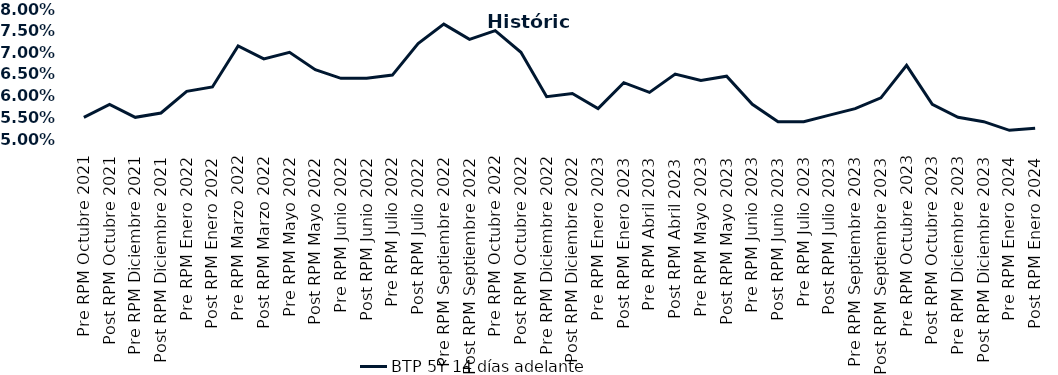
| Category | BTP 5Y 14 días adelante |
|---|---|
| Pre RPM Octubre 2021 | 0.055 |
| Post RPM Octubre 2021 | 0.058 |
| Pre RPM Diciembre 2021 | 0.055 |
| Post RPM Diciembre 2021 | 0.056 |
| Pre RPM Enero 2022 | 0.061 |
| Post RPM Enero 2022 | 0.062 |
| Pre RPM Marzo 2022 | 0.072 |
| Post RPM Marzo 2022 | 0.068 |
| Pre RPM Mayo 2022 | 0.07 |
| Post RPM Mayo 2022 | 0.066 |
| Pre RPM Junio 2022 | 0.064 |
| Post RPM Junio 2022 | 0.064 |
| Pre RPM Julio 2022 | 0.065 |
| Post RPM Julio 2022 | 0.072 |
| Pre RPM Septiembre 2022 | 0.076 |
| Post RPM Septiembre 2022 | 0.073 |
| Pre RPM Octubre 2022 | 0.075 |
| Post RPM Octubre 2022 | 0.07 |
| Pre RPM Diciembre 2022 | 0.06 |
| Post RPM Diciembre 2022 | 0.06 |
| Pre RPM Enero 2023 | 0.057 |
| Post RPM Enero 2023 | 0.063 |
| Pre RPM Abril 2023 | 0.061 |
| Post RPM Abril 2023 | 0.065 |
| Pre RPM Mayo 2023 | 0.064 |
| Post RPM Mayo 2023 | 0.064 |
| Pre RPM Junio 2023 | 0.058 |
| Post RPM Junio 2023 | 0.054 |
| Pre RPM Julio 2023 | 0.054 |
| Post RPM Julio 2023 | 0.056 |
| Pre RPM Septiembre 2023 | 0.057 |
| Post RPM Septiembre 2023 | 0.06 |
| Pre RPM Octubre 2023 | 0.067 |
| Post RPM Octubre 2023 | 0.058 |
| Pre RPM Diciembre 2023 | 0.055 |
| Post RPM Diciembre 2023 | 0.054 |
| Pre RPM Enero 2024 | 0.052 |
| Post RPM Enero 2024 | 0.052 |